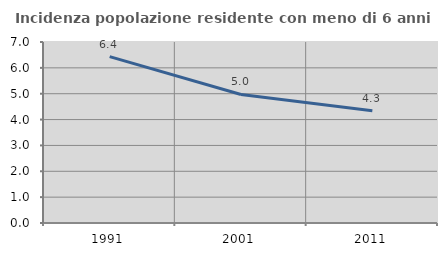
| Category | Incidenza popolazione residente con meno di 6 anni |
|---|---|
| 1991.0 | 6.434 |
| 2001.0 | 4.97 |
| 2011.0 | 4.337 |